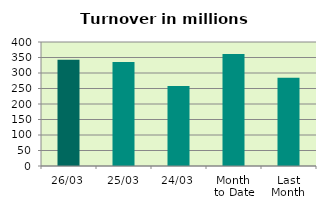
| Category | Series 0 |
|---|---|
| 26/03 | 343.129 |
| 25/03 | 335.73 |
| 24/03 | 258.13 |
| Month 
to Date | 360.977 |
| Last
Month | 285.08 |